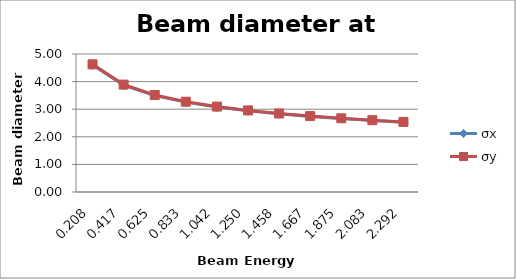
| Category | σx | σy |
|---|---|---|
| 0.20833333333333334 | 4.603 | 4.627 |
| 0.4166666666666667 | 3.871 | 3.89 |
| 0.625 | 3.498 | 3.515 |
| 0.8333333333333334 | 3.256 | 3.271 |
| 1.0416666666666667 | 3.08 | 3.094 |
| 1.25 | 2.943 | 2.956 |
| 1.4583333333333333 | 2.832 | 2.844 |
| 1.6666666666666667 | 2.739 | 2.751 |
| 1.875 | 2.66 | 2.671 |
| 2.0833333333333335 | 2.591 | 2.602 |
| 2.2916666666666665 | 2.53 | 2.54 |